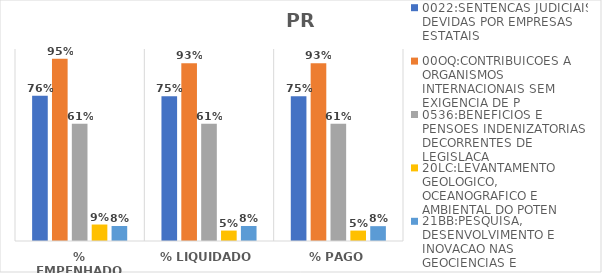
| Category | 0022:SENTENCAS JUDICIAIS DEVIDAS POR EMPRESAS ESTATAIS | 00OQ:CONTRIBUICOES A ORGANISMOS INTERNACIONAIS SEM EXIGENCIA DE P | 0536:BENEFICIOS E PENSOES INDENIZATORIAS DECORRENTES DE LEGISLACA | 20LC:LEVANTAMENTO GEOLOGICO, OCEANOGRAFICO E AMBIENTAL DO POTEN | 21BB:PESQUISA, DESENVOLVIMENTO E INOVACAO NAS GEOCIENCIAS E |
|---|---|---|---|---|---|
| % EMPENHADO | 0.756 | 0.95 | 0.611 | 0.086 | 0.078 |
| % LIQUIDADO | 0.754 | 0.926 | 0.611 | 0.054 | 0.078 |
| % PAGO | 0.754 | 0.926 | 0.611 | 0.054 | 0.077 |